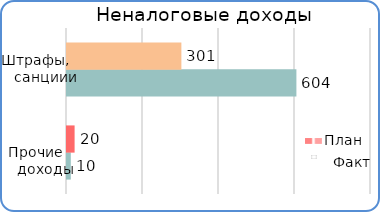
| Category | Факт | План  |
|---|---|---|
| Штрафы,санкции | 10000 | 20000 |
| Прочие доходы | 603700 | 301000 |